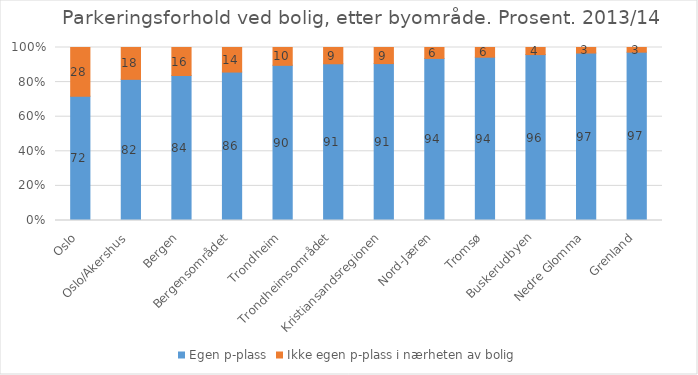
| Category | Egen p-plass | Ikke egen p-plass i nærheten av bolig |
|---|---|---|
| Oslo | 71.8 | 28.2 |
| Oslo/Akershus | 81.6 | 18.4 |
| Bergen | 83.8 | 16.2 |
| Bergensområdet | 85.8 | 14.2 |
| Trondheim | 89.7 | 10.3 |
| Trondheimsområdet | 90.6 | 9.4 |
| Kristiansandsregionen | 90.7 | 9.3 |
| Nord-Jæren | 93.7 | 6.3 |
| Tromsø | 94.4 | 5.6 |
| Buskerudbyen | 95.9 | 4.1 |
| Nedre Glomma | 96.8 | 3.2 |
| Grenland | 97.3 | 2.7 |